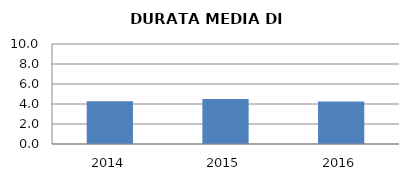
| Category | 2014 2015 2016 |
|---|---|
| 2014.0 | 4.287 |
| 2015.0 | 4.5 |
| 2016.0 | 4.252 |